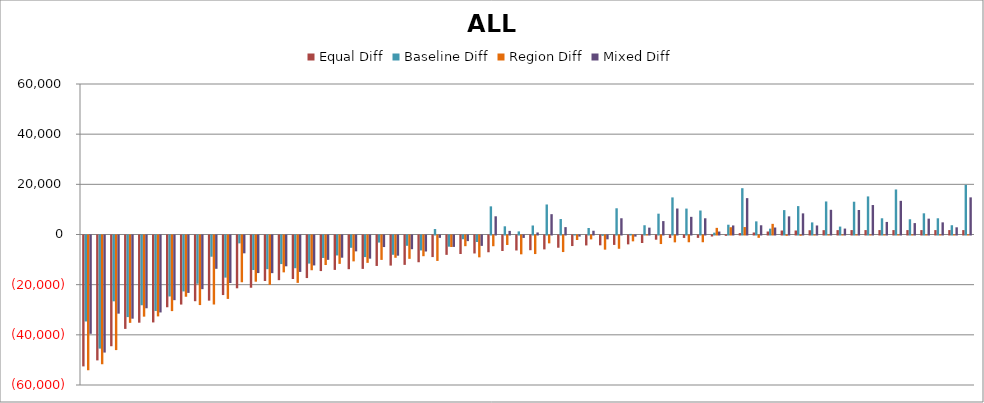
| Category | Equal Diff | Baseline Diff | Region Diff | Mixed Diff |
|---|---|---|---|---|
| 0 | -52183.43 | -34279.43 | -53720.43 | -39194.43 |
| 1 | -49789.622 | -45085.622 | -51326.622 | -46664.622 |
| 2 | -44146.233 | -26242.233 | -45683.233 | -31157.233 |
| 3 | -37234.345 | -32530.345 | -34825.345 | -33156.345 |
| 4 | -34761.361 | -27813.361 | -32352.361 | -29006.361 |
| 5 | -34658.601 | -30086.601 | -32249.601 | -30679.601 |
| 6 | -28609.225 | -24301.225 | -30146.225 | -25780.225 |
| 7 | -27532.77 | -22300.77 | -24415.77 | -22888.77 |
| 8 | -26196.887 | -19248.887 | -27733.887 | -21394.887 |
| 9 | -25972.836 | -8464.836 | -27509.836 | -13279.836 |
| 10 | -23745.803 | -16797.803 | -25282.803 | -18943.803 |
| 11 | -21047.084 | -3143.084 | -18638.084 | -7104.084 |
| 12 | -20829.771 | -13749.771 | -18420.771 | -14975.771 |
| 13 | -18129.367 | -13425.367 | -19666.367 | -15004.367 |
| 14 | -17809.295 | -11389.295 | -14692.295 | -12277.295 |
| 15 | -17347.716 | -13039.716 | -18884.716 | -14518.716 |
| 16 | -16968.682 | -11208.682 | -13851.682 | -11930.682 |
| 17 | -14184.049 | -8952.049 | -11775.049 | -9711.049 |
| 18 | -13719.101 | -7959.101 | -11310.101 | -8852.101 |
| 19 | -13432.72 | -4900.72 | -10315.72 | -6322.72 |
| 20 | -13313.114 | -8609.114 | -10904.114 | -9235.114 |
| 21 | -12138.952 | -2814.952 | -9729.952 | -4607.952 |
| 22 | -11999.131 | -7691.131 | -8882.131 | -8046.131 |
| 23 | -11712.75 | -4104.75 | -9303.75 | -5464.75 |
| 24 | -10659.879 | -5955.879 | -8250.879 | -6379.879 |
| 25 | -8597.936 | 2178.064 | -10134.936 | -935.936 |
| 26 | -7713.524 | -4461.524 | -4596.524 | -4549.524 |
| 27 | -7376.606 | -1484.606 | -4259.606 | -2239.606 |
| 28 | -7166.031 | -2594.031 | -8703.031 | -4140.031 |
| 29 | -6682.553 | 11221.447 | -4273.553 | 7260.447 |
| 30 | -6188.967 | 3267.033 | -3779.967 | 1440.033 |
| 31 | -5971.654 | 1240.346 | -7508.654 | -972.654 |
| 32 | -5862.156 | 3593.844 | -7399.156 | 813.844 |
| 33 | -5540.398 | 11967.602 | -3131.398 | 8106.602 |
| 34 | -4873.299 | 6166.701 | -6600.299 | 2940.701 |
| 35 | -4206.2 | 101.8 | -1797.2 | -424.2 |
| 36 | -3960.25 | 2591.75 | -1551.25 | 1498.75 |
| 37 | -3916.45 | -136.45 | -5643.45 | -1528.45 |
| 38 | -3751.36 | 10456.64 | -5288.36 | 6475.64 |
| 39 | -3535.732 | 244.268 | -2328.732 | -438.732 |
| 40 | -2994.977 | 3689.023 | 52.023 | 2734.023 |
| 41 | -1680.994 | 8303.006 | -3407.994 | 5343.006 |
| 42 | -1005.472 | 14786.528 | -2732.472 | 10359.528 |
| 43 | -970.096 | 10333.904 | -2697.096 | 7040.904 |
| 44 | -948.196 | 9563.804 | -2688.196 | 6467.804 |
| 45 | -402.388 | 737.612 | 2644.612 | 1183.612 |
| 46 | -142.96 | 3901.04 | 2904.04 | 3613.04 |
| 47 | 556.146 | 18460.146 | 2965.146 | 14499.146 |
| 48 | 798.728 | 5238.728 | -928.272 | 3679.728 |
| 49 | 1196.292 | 2336.292 | 4243.292 | 2782.292 |
| 50 | 1590.487 | 9726.487 | -136.513 | 7233.487 |
| 51 | 1598.91 | 11318.91 | -128.09 | 8425.91 |
| 52 | 1705.039 | 4825.039 | -21.961 | 3600.039 |
| 53 | 1735.362 | 13171.362 | 8.362 | 9845.362 |
| 54 | 1748.839 | 3152.839 | 21.839 | 2360.839 |
| 55 | 1764 | 13068 | 37 | 9775 |
| 56 | 1765 | 15180 | 37 | 11746 |
| 57 | 1766 | 6468 | 37 | 5010 |
| 58 | 1764 | 17952 | 37 | 13425 |
| 59 | 1764 | 6072 | 37 | 4547 |
| 60 | 1764 | 8448 | 37 | 6322 |
| 61 | 1764 | 6468 | 37 | 4843 |
| 62 | 1764 | 3696 | 37 | 2867 |
| 63 | 1764 | 19800 | 37 | 14806 |